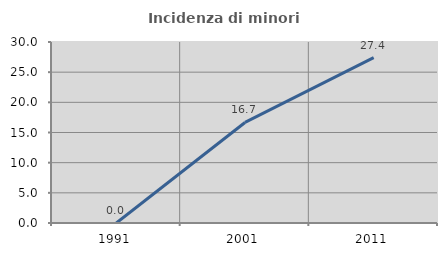
| Category | Incidenza di minori stranieri |
|---|---|
| 1991.0 | 0 |
| 2001.0 | 16.667 |
| 2011.0 | 27.397 |